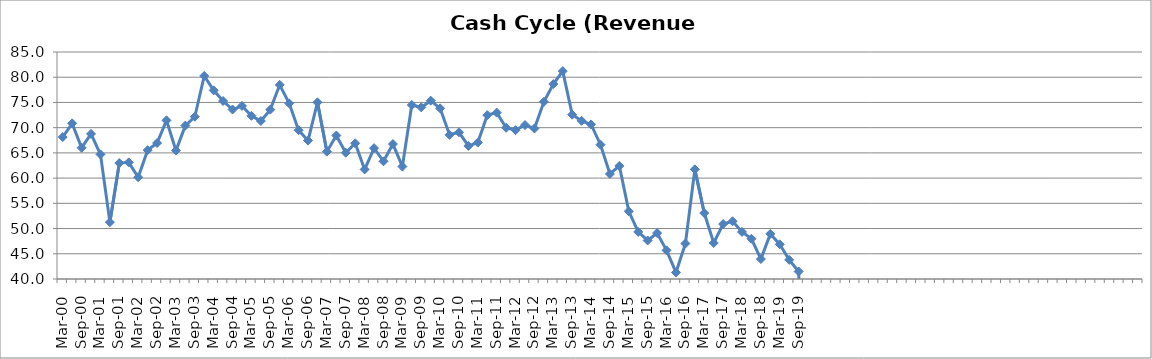
| Category | Series 0 |
|---|---|
| Mar-00 | 68.134 |
| Jun-00 | 70.854 |
| Sep-00 | 66.007 |
| Dec-00 | 68.763 |
| Mar-01 | 64.704 |
| Jun-01 | 51.27 |
| Sep-01 | 62.985 |
| Dec-01 | 63.119 |
| Mar-02 | 60.179 |
| Jun-02 | 65.546 |
| Sep-02 | 66.958 |
| Dec-02 | 71.449 |
| Mar-03 | 65.467 |
| Jun-03 | 70.409 |
| Sep-03 | 72.165 |
| Dec-03 | 80.251 |
| Mar-04 | 77.395 |
| Jun-04 | 75.285 |
| Sep-04 | 73.593 |
| Dec-04 | 74.31 |
| Mar-05 | 72.351 |
| Jun-05 | 71.325 |
| Sep-05 | 73.577 |
| Dec-05 | 78.493 |
| Mar-06 | 74.819 |
| Jun-06 | 69.49 |
| Sep-06 | 67.441 |
| Dec-06 | 75.025 |
| Mar-07 | 65.247 |
| Jun-07 | 68.45 |
| Sep-07 | 65.025 |
| Dec-07 | 66.902 |
| Mar-08 | 61.721 |
| Jun-08 | 65.936 |
| Sep-08 | 63.333 |
| Dec-08 | 66.752 |
| Mar-09 | 62.3 |
| Jun-09 | 74.497 |
| Sep-09 | 74.018 |
| Dec-09 | 75.355 |
| Mar-10 | 73.828 |
| Jun-10 | 68.584 |
| Sep-10 | 69.081 |
| Dec-10 | 66.377 |
| Mar-11 | 67.041 |
| Jun-11 | 72.488 |
| Sep-11 | 72.984 |
| Dec-11 | 69.98 |
| Mar-12 | 69.515 |
| Jun-12 | 70.524 |
| Sep-12 | 69.838 |
| Dec-12 | 75.131 |
| Mar-13 | 78.646 |
| Jun-13 | 81.211 |
| Sep-13 | 72.579 |
| Dec-13 | 71.347 |
| Mar-14 | 70.632 |
| Jun-14 | 66.624 |
| Sep-14 | 60.821 |
| Dec-14 | 62.42 |
| Mar-15 | 53.418 |
| Jun-15 | 49.327 |
| Sep-15 | 47.64 |
| Dec-15 | 49.109 |
| Mar-16 | 45.686 |
| Jun-16 | 41.298 |
| Sep-16 | 47.027 |
| Dec-16 | 61.739 |
| Mar-17 | 53.072 |
| Jun-17 | 47.135 |
| Sep-17 | 50.892 |
| Dec-17 | 51.434 |
| Mar-18 | 49.328 |
| Jun-18 | 47.98 |
| Sep-18 | 43.954 |
| Dec-18 | 48.945 |
| Mar-19 | 46.878 |
| Jun-19 | 43.792 |
| Sep-19 | 41.494 |